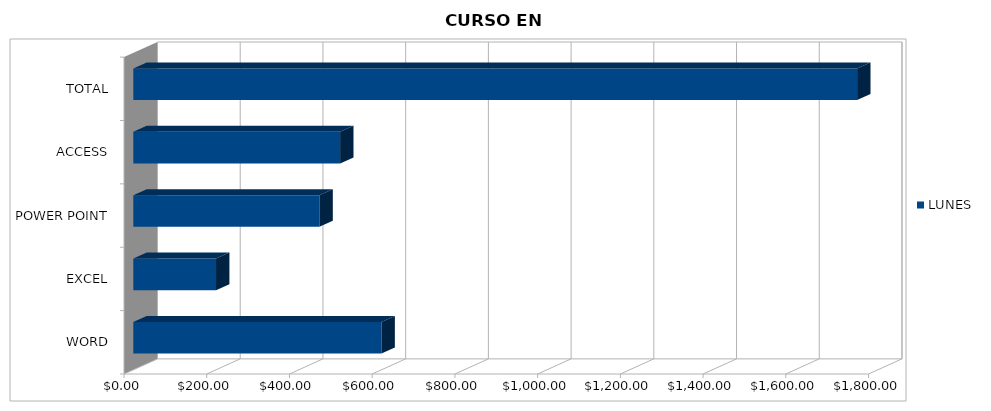
| Category | LUNES |
|---|---|
| WORD | 600 |
| EXCEL | 200 |
| POWER POINT | 450 |
| ACCESS | 500 |
| TOTAL | 1750 |